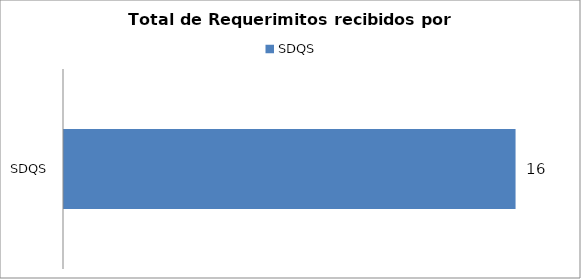
| Category | Total |
|---|---|
| SDQS | 16 |